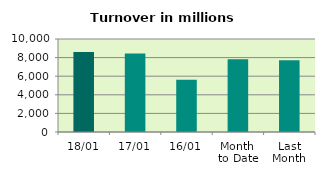
| Category | Series 0 |
|---|---|
| 18/01 | 8605.396 |
| 17/01 | 8442.027 |
| 16/01 | 5630.586 |
| Month 
to Date | 7815.586 |
| Last
Month | 7707.734 |